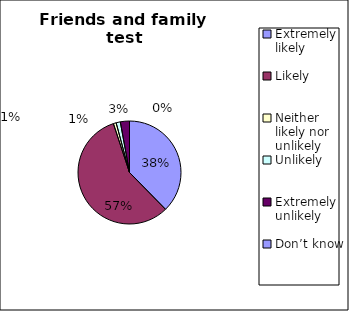
| Category | Series 0 |
|---|---|
| Extremely likely  | 171 |
| Likely  | 260 |
| Neither likely nor unlikely | 4 |
| Unlikely  | 6 |
| Extremely unlikely  | 13 |
| Don’t know  | 0 |